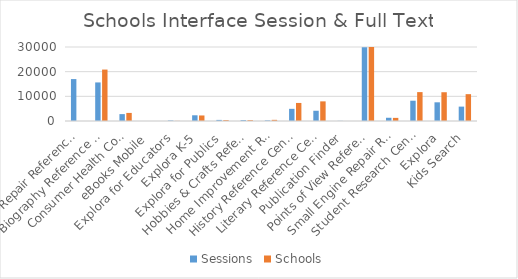
| Category | Sessions | Schools |
|---|---|---|
| Auto Repair Reference Center | 16996 | 0 |
| Biography Reference Center | 15635 | 20851 |
| Consumer Health Complete | 2793 | 3276 |
| eBooks Mobile | 7 | 0 |
| Explora for Educators | 215 | 50 |
| Explora K-5 | 2315 | 2243 |
| Explora for Publics | 444 | 368 |
| Hobbies & Crafts Reference Center | 367 | 346 |
| Home Improvement Reference Center | 249 | 471 |
| History Reference Center | 4933 | 7319 |
| Literary Reference Center / LRC Plus | 4156 | 7960 |
| Publication Finder | 62 | 0 |
| Points of View Reference Center | 29893 | 63037 |
| Small Engine Repair Reference Center | 1313 | 1266 |
| Student Research Center | 8227 | 11713 |
| Explora | 7576 | 11662 |
| Kids Search | 5833 | 10882 |